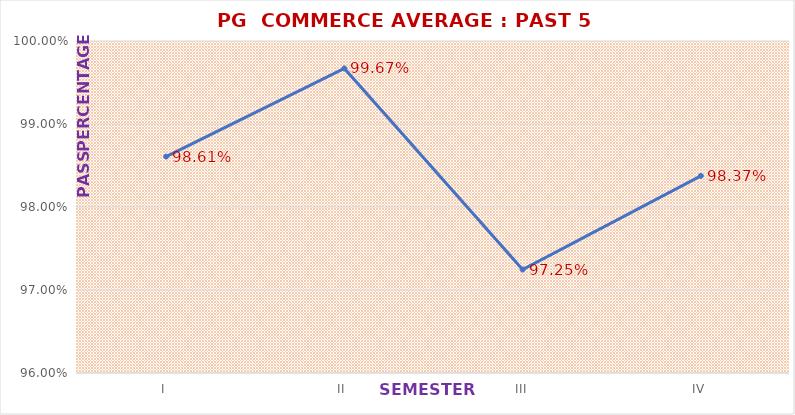
| Category | PG  COMMERCE |
|---|---|
| I | 0.986 |
| II | 0.997 |
| III | 0.972 |
| IV | 0.984 |